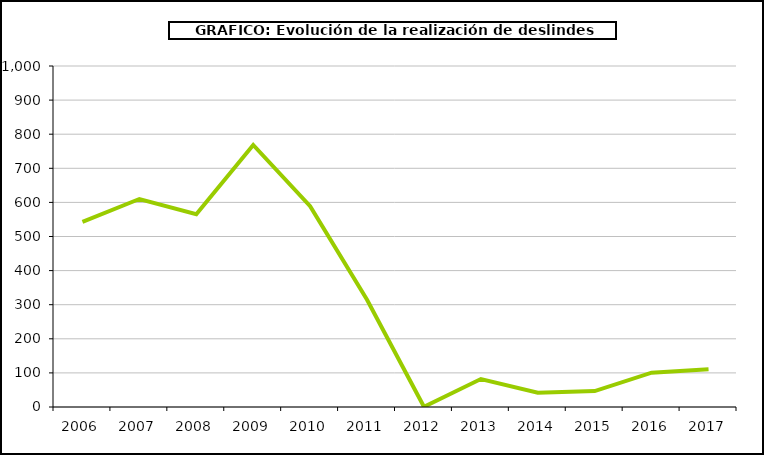
| Category | Series 0 |
|---|---|
| 2006.0 | 542.899 |
| 2007.0 | 609.979 |
| 2008.0 | 565.426 |
| 2009.0 | 768.343 |
| 2010.0 | 588.854 |
| 2011.0 | 314.421 |
| 2012.0 | 0.6 |
| 2013.0 | 81.928 |
| 2014.0 | 41.8 |
| 2015.0 | 46.663 |
| 2016.0 | 100.58 |
| 2017.0 | 110.76 |